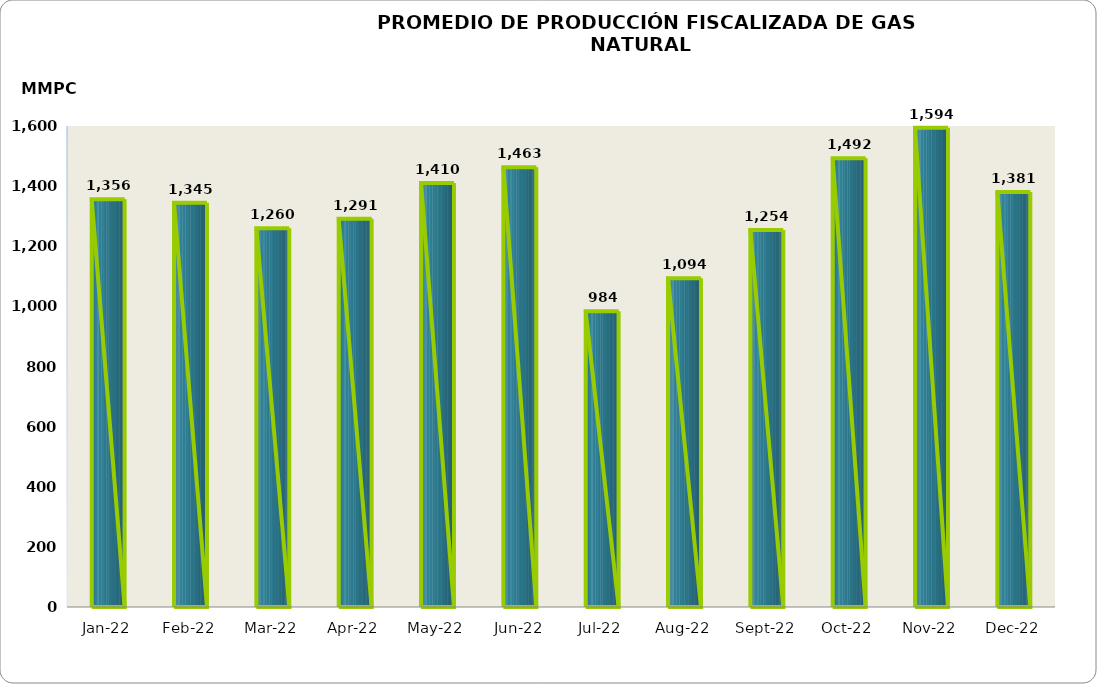
| Category | Series 0 |
|---|---|
| 2022-01-01 | 1356402.082 |
| 2022-02-01 | 1344504.622 |
| 2022-03-01 | 1259914.198 |
| 2022-04-01 | 1291170.944 |
| 2022-05-01 | 1410361.644 |
| 2022-06-01 | 1462840.082 |
| 2022-07-01 | 983913.442 |
| 2022-08-01 | 1093528.82 |
| 2022-09-01 | 1253987.9 |
| 2022-10-01 | 1492396.38 |
| 2022-11-01 | 1593827.373 |
| 2022-12-01 | 1380789.661 |